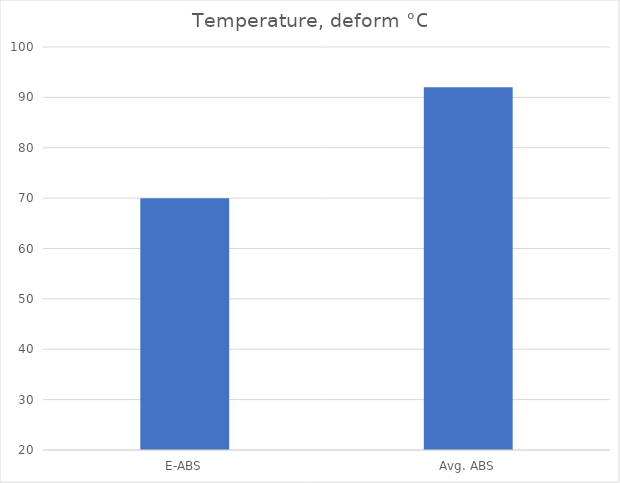
| Category | Deform °C |
|---|---|
| E-ABS | 70 |
| Avg. ABS | 92 |